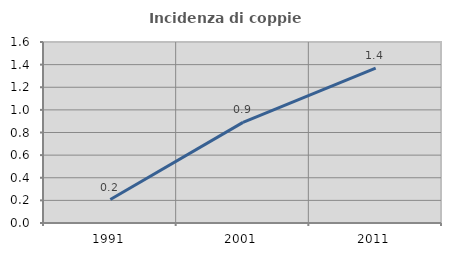
| Category | Incidenza di coppie miste |
|---|---|
| 1991.0 | 0.208 |
| 2001.0 | 0.889 |
| 2011.0 | 1.37 |